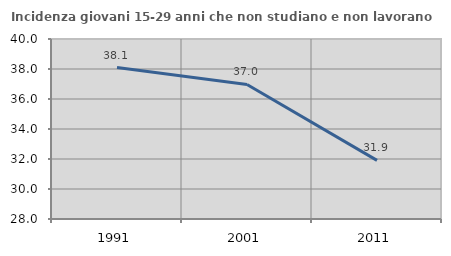
| Category | Incidenza giovani 15-29 anni che non studiano e non lavorano  |
|---|---|
| 1991.0 | 38.095 |
| 2001.0 | 36.972 |
| 2011.0 | 31.907 |